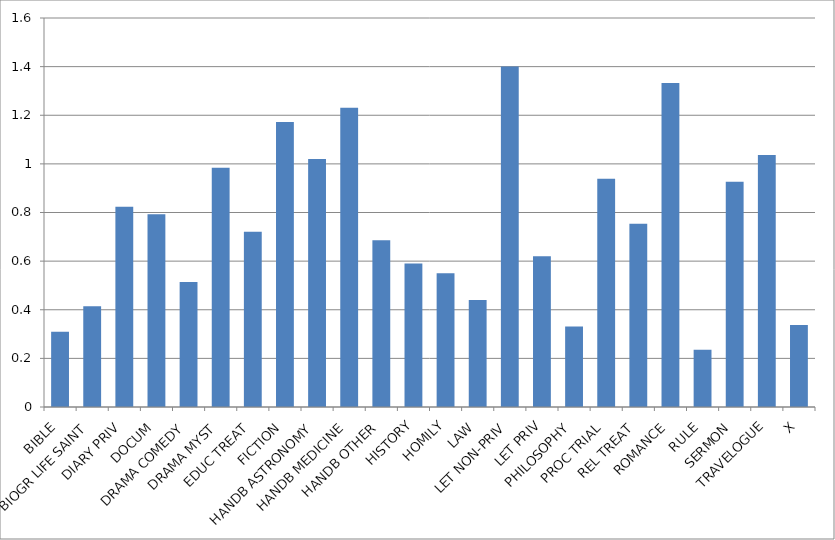
| Category | Hits per 1000 words |
|---|---|
| BIBLE | 0.309 |
| BIOGR LIFE SAINT | 0.414 |
| DIARY PRIV | 0.824 |
| DOCUM | 0.793 |
| DRAMA COMEDY | 0.514 |
| DRAMA MYST | 0.984 |
| EDUC TREAT | 0.72 |
| FICTION | 1.172 |
| HANDB ASTRONOMY | 1.02 |
| HANDB MEDICINE | 1.231 |
| HANDB OTHER | 0.686 |
| HISTORY | 0.591 |
| HOMILY | 0.55 |
| LAW | 0.44 |
| LET NON-PRIV | 1.401 |
| LET PRIV | 0.62 |
| PHILOSOPHY | 0.331 |
| PROC TRIAL | 0.939 |
| REL TREAT | 0.754 |
| ROMANCE | 1.333 |
| RULE | 0.235 |
| SERMON | 0.926 |
| TRAVELOGUE | 1.037 |
| X | 0.337 |